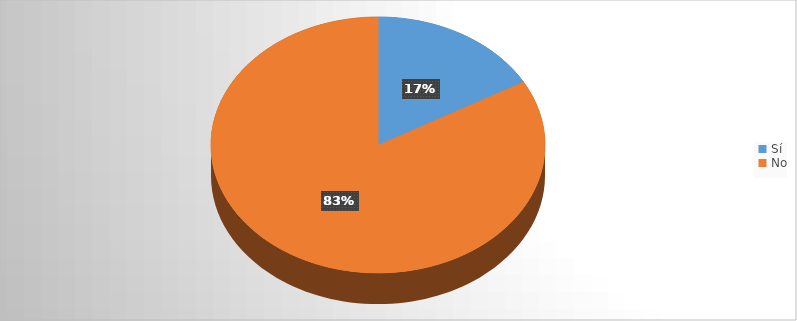
| Category | Series 0 |
|---|---|
| Sí | 68 |
| No | 337 |